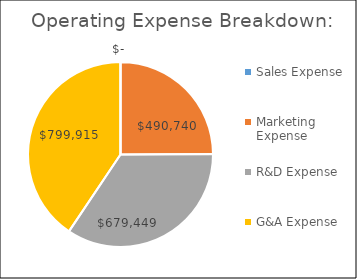
| Category | Series 0 |
|---|---|
| Sales Expense | 0 |
| Marketing Expense | 490740 |
| R&D Expense | 679448.75 |
| G&A Expense | 799915 |